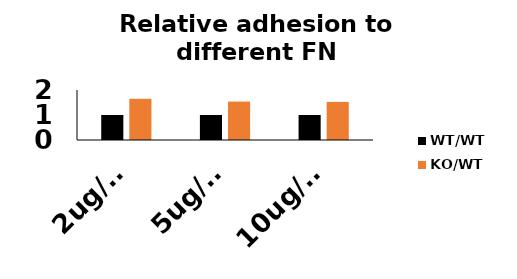
| Category | WT/WT | KO/WT |
|---|---|---|
| 2ug/ml | 1 | 1.649 |
| 5ug/ml | 1 | 1.536 |
| 10ug/ml | 1 | 1.523 |